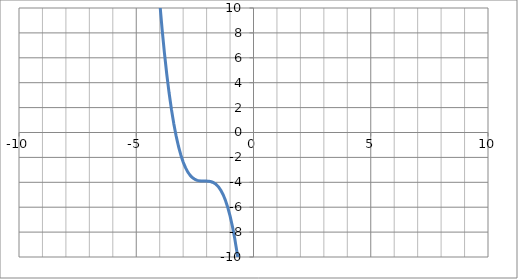
| Category | f(x) |
|---|---|
| -10.0 | 1031.482 |
| -9.9 | 992.659 |
| -9.8 | 954.819 |
| -9.700000000000001 | 917.95 |
| -9.600000000000001 | 882.038 |
| -9.500000000000002 | 847.07 |
| -9.400000000000002 | 813.036 |
| -9.300000000000002 | 779.921 |
| -9.200000000000003 | 747.713 |
| -9.100000000000003 | 716.4 |
| -9.000000000000004 | 685.969 |
| -8.900000000000004 | 656.407 |
| -8.800000000000004 | 627.702 |
| -8.700000000000005 | 599.842 |
| -8.600000000000005 | 572.813 |
| -8.500000000000005 | 546.602 |
| -8.400000000000006 | 521.199 |
| -8.300000000000006 | 496.589 |
| -8.200000000000006 | 472.76 |
| -8.100000000000007 | 449.7 |
| -8.000000000000007 | 427.396 |
| -7.9000000000000075 | 405.835 |
| -7.800000000000008 | 385.005 |
| -7.700000000000008 | 364.894 |
| -7.6000000000000085 | 345.488 |
| -7.500000000000009 | 326.774 |
| -7.400000000000009 | 308.742 |
| -7.30000000000001 | 291.377 |
| -7.20000000000001 | 274.667 |
| -7.10000000000001 | 258.6 |
| -7.000000000000011 | 243.163 |
| -6.900000000000011 | 228.343 |
| -6.800000000000011 | 214.128 |
| -6.700000000000012 | 200.506 |
| -6.600000000000012 | 187.463 |
| -6.500000000000012 | 174.986 |
| -6.400000000000013 | 163.065 |
| -6.300000000000013 | 151.685 |
| -6.2000000000000135 | 140.834 |
| -6.100000000000014 | 130.5 |
| -6.000000000000014 | 120.67 |
| -5.900000000000015 | 111.331 |
| -5.800000000000015 | 102.471 |
| -5.700000000000015 | 94.078 |
| -5.600000000000016 | 86.138 |
| -5.500000000000016 | 78.638 |
| -5.400000000000016 | 71.568 |
| -5.300000000000017 | 64.913 |
| -5.200000000000017 | 58.661 |
| -5.100000000000017 | 52.8 |
| -5.000000000000018 | 47.317 |
| -4.900000000000018 | 42.199 |
| -4.8000000000000185 | 37.434 |
| -4.700000000000019 | 33.01 |
| -4.600000000000019 | 28.913 |
| -4.5000000000000195 | 25.13 |
| -4.40000000000002 | 21.651 |
| -4.30000000000002 | 18.461 |
| -4.200000000000021 | 15.548 |
| -4.100000000000021 | 12.9 |
| -4.000000000000021 | 10.504 |
| -3.9000000000000212 | 8.347 |
| -3.800000000000021 | 6.417 |
| -3.700000000000021 | 4.702 |
| -3.600000000000021 | 3.188 |
| -3.500000000000021 | 1.862 |
| -3.400000000000021 | 0.714 |
| -3.3000000000000207 | -0.271 |
| -3.2000000000000206 | -1.105 |
| -3.1000000000000205 | -1.8 |
| -3.0000000000000204 | -2.369 |
| -2.9000000000000203 | -2.825 |
| -2.8000000000000203 | -3.18 |
| -2.70000000000002 | -3.446 |
| -2.60000000000002 | -3.637 |
| -2.50000000000002 | -3.766 |
| -2.40000000000002 | -3.843 |
| -2.30000000000002 | -3.883 |
| -2.2000000000000197 | -3.898 |
| -2.1000000000000196 | -3.9 |
| -2.0000000000000195 | -3.902 |
| -1.9000000000000195 | -3.917 |
| -1.8000000000000194 | -3.957 |
| -1.7000000000000193 | -4.034 |
| -1.6000000000000192 | -4.162 |
| -1.500000000000019 | -4.354 |
| -1.400000000000019 | -4.62 |
| -1.300000000000019 | -4.975 |
| -1.2000000000000188 | -5.431 |
| -1.1000000000000187 | -6 |
| -1.0000000000000187 | -6.695 |
| -0.9000000000000187 | -7.529 |
| -0.8000000000000187 | -8.514 |
| -0.7000000000000187 | -9.662 |
| -0.6000000000000187 | -10.987 |
| -0.5000000000000188 | -12.502 |
| -0.4000000000000188 | -14.217 |
| -0.3000000000000188 | -16.147 |
| -0.2000000000000188 | -18.304 |
| -0.1000000000000188 | -20.7 |
| -1.8790524691780774e-14 | -23.348 |
| 0.09999999999998122 | -26.261 |
| 0.19999999999998122 | -29.451 |
| 0.2999999999999812 | -32.93 |
| 0.39999999999998126 | -36.712 |
| 0.49999999999998124 | -40.81 |
| 0.5999999999999812 | -45.234 |
| 0.6999999999999812 | -49.999 |
| 0.7999999999999812 | -55.117 |
| 0.8999999999999811 | -60.6 |
| 0.9999999999999811 | -66.461 |
| 1.0999999999999812 | -72.713 |
| 1.1999999999999813 | -79.368 |
| 1.2999999999999814 | -86.438 |
| 1.3999999999999815 | -93.937 |
| 1.4999999999999816 | -101.878 |
| 1.5999999999999817 | -110.271 |
| 1.6999999999999817 | -119.131 |
| 1.7999999999999818 | -128.47 |
| 1.899999999999982 | -138.3 |
| 1.999999999999982 | -148.634 |
| 2.099999999999982 | -159.485 |
| 2.199999999999982 | -170.865 |
| 2.299999999999982 | -182.786 |
| 2.399999999999982 | -195.262 |
| 2.4999999999999822 | -208.306 |
| 2.5999999999999823 | -221.928 |
| 2.6999999999999824 | -236.143 |
| 2.7999999999999825 | -250.963 |
| 2.8999999999999826 | -266.4 |
| 2.9999999999999827 | -282.467 |
| 3.0999999999999828 | -299.177 |
| 3.199999999999983 | -316.542 |
| 3.299999999999983 | -334.574 |
| 3.399999999999983 | -353.287 |
| 3.499999999999983 | -372.694 |
| 3.599999999999983 | -392.805 |
| 3.6999999999999833 | -413.635 |
| 3.7999999999999834 | -435.196 |
| 3.8999999999999835 | -457.5 |
| 3.9999999999999836 | -480.56 |
| 4.099999999999984 | -504.389 |
| 4.199999999999983 | -528.999 |
| 4.299999999999983 | -554.402 |
| 4.399999999999983 | -580.612 |
| 4.499999999999982 | -607.642 |
| 4.599999999999982 | -635.502 |
| 4.6999999999999815 | -664.207 |
| 4.799999999999981 | -693.769 |
| 4.899999999999981 | -724.2 |
| 4.9999999999999805 | -755.513 |
| 5.09999999999998 | -787.721 |
| 5.19999999999998 | -820.836 |
| 5.299999999999979 | -854.87 |
| 5.399999999999979 | -889.837 |
| 5.499999999999979 | -925.75 |
| 5.599999999999978 | -962.619 |
| 5.699999999999978 | -1000.459 |
| 5.799999999999978 | -1039.282 |
| 5.899999999999977 | -1079.1 |
| 5.999999999999977 | -1119.926 |
| 6.0999999999999766 | -1161.773 |
| 6.199999999999976 | -1204.653 |
| 6.299999999999976 | -1248.578 |
| 6.3999999999999755 | -1293.562 |
| 6.499999999999975 | -1339.618 |
| 6.599999999999975 | -1386.756 |
| 6.699999999999974 | -1434.991 |
| 6.799999999999974 | -1484.335 |
| 6.899999999999974 | -1534.8 |
| 6.999999999999973 | -1586.399 |
| 7.099999999999973 | -1639.145 |
| 7.199999999999973 | -1693.05 |
| 7.299999999999972 | -1748.126 |
| 7.399999999999972 | -1804.387 |
| 7.499999999999972 | -1861.846 |
| 7.599999999999971 | -1920.513 |
| 7.699999999999971 | -1980.403 |
| 7.7999999999999705 | -2041.528 |
| 7.89999999999997 | -2103.9 |
| 7.99999999999997 | -2167.532 |
| 8.09999999999997 | -2232.437 |
| 8.199999999999969 | -2298.627 |
| 8.299999999999969 | -2366.114 |
| 8.399999999999968 | -2434.912 |
| 8.499999999999968 | -2505.034 |
| 8.599999999999968 | -2576.49 |
| 8.699999999999967 | -2649.295 |
| 8.799999999999967 | -2723.461 |
| 8.899999999999967 | -2799 |
| 8.999999999999966 | -2875.925 |
| 9.099999999999966 | -2954.249 |
| 9.199999999999966 | -3033.984 |
| 9.299999999999965 | -3115.142 |
| 9.399999999999965 | -3197.737 |
| 9.499999999999964 | -3281.782 |
| 9.599999999999964 | -3367.287 |
| 9.699999999999964 | -3454.267 |
| 9.799999999999963 | -3542.734 |
| 9.899999999999963 | -3632.7 |
| 9.999999999999963 | -3724.178 |